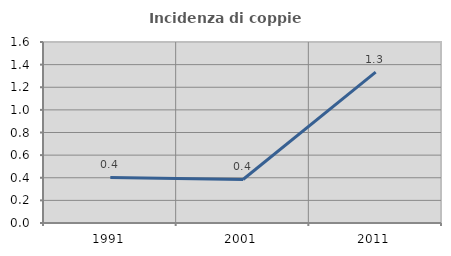
| Category | Incidenza di coppie miste |
|---|---|
| 1991.0 | 0.402 |
| 2001.0 | 0.385 |
| 2011.0 | 1.333 |